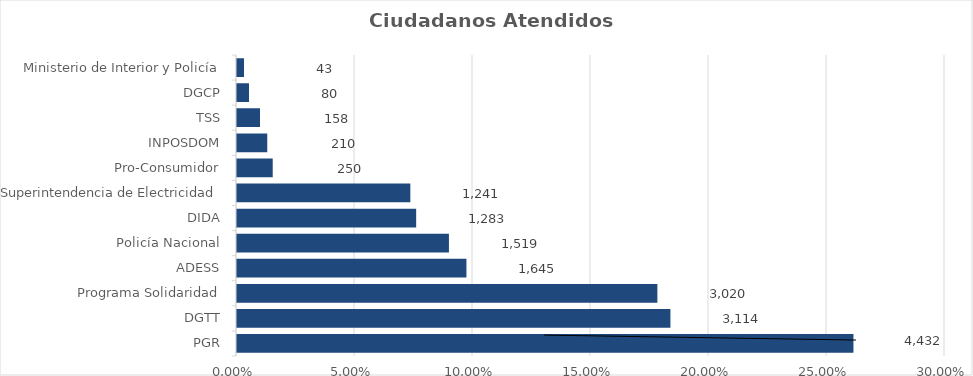
| Category | Porcentaje |
|---|---|
| PGR | 0.261 |
| DGTT | 0.183 |
| Programa Solidaridad | 0.178 |
| ADESS | 0.097 |
| Policía Nacional | 0.089 |
| DIDA | 0.075 |
| Superintendencia de Electricidad | 0.073 |
| Pro-Consumidor | 0.015 |
| INPOSDOM | 0.012 |
| TSS | 0.009 |
| DGCP | 0.005 |
| Ministerio de Interior y Policía | 0.003 |